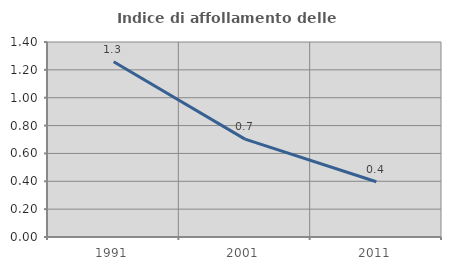
| Category | Indice di affollamento delle abitazioni  |
|---|---|
| 1991.0 | 1.259 |
| 2001.0 | 0.703 |
| 2011.0 | 0.396 |